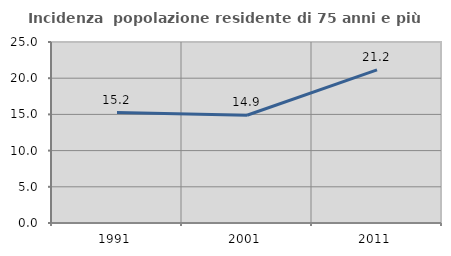
| Category | Incidenza  popolazione residente di 75 anni e più |
|---|---|
| 1991.0 | 15.245 |
| 2001.0 | 14.888 |
| 2011.0 | 21.16 |